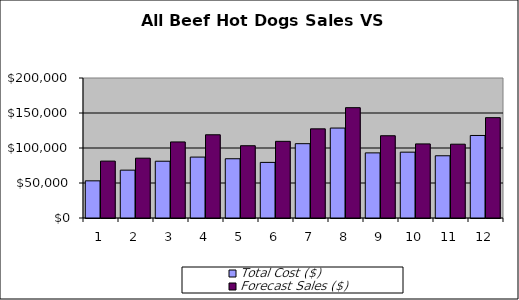
| Category | Total Cost ($) | Forecast Sales ($) |
|---|---|---|
| 0 | 53085.346 | 81280 |
| 1 | 68348.329 | 85449 |
| 2 | 81107.614 | 108678 |
| 3 | 87017.207 | 118895 |
| 4 | 84657.857 | 103250 |
| 5 | 79436.803 | 109531 |
| 6 | 106173.536 | 127350 |
| 7 | 128490.794 | 157613 |
| 8 | 93029.257 | 117504 |
| 9 | 94047.929 | 105868 |
| 10 | 88884.892 | 105444 |
| 11 | 117890.559 | 143360 |